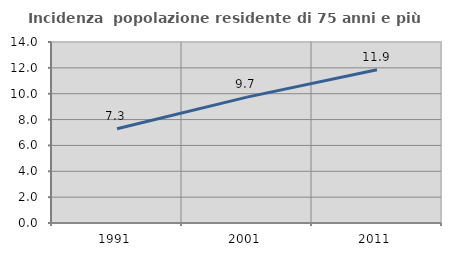
| Category | Incidenza  popolazione residente di 75 anni e più |
|---|---|
| 1991.0 | 7.295 |
| 2001.0 | 9.734 |
| 2011.0 | 11.853 |